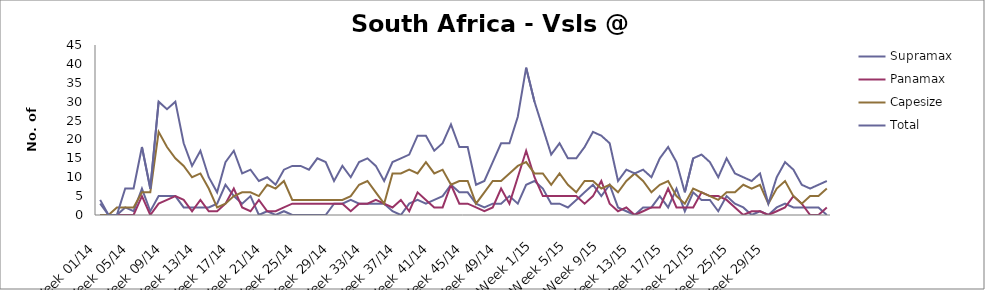
| Category | Supramax | Panamax | Capesize | Total |
|---|---|---|---|---|
| Week 01/14 | 3 | 0 | 0 | 4 |
| Week 02/14 | 0 | 0 | 0 | 0 |
| Week 03/14 | 0 | 0 | 2 | 0 |
| Week 04/14 | 2 | 0 | 2 | 7 |
| Week 05/14 | 1 | 0 | 2 | 7 |
| Week 06/14 | 7 | 5 | 6 | 18 |
| Week 07/14 | 1 | 0 | 6 | 7 |
| Week 08/14 | 5 | 3 | 22 | 30 |
| Week 09/14 | 5 | 4 | 18 | 28 |
| Week 10/14 | 5 | 5 | 15 | 30 |
| Week 11/14 | 2 | 4 | 13 | 19 |
| Week 12/14 | 2 | 1 | 10 | 13 |
| Week 13/14 | 2 | 4 | 11 | 17 |
| Week 14/14 | 2 | 1 | 7 | 10 |
| Week 15/14 | 3 | 1 | 2 | 6 |
| Week 16/14 | 8 | 3 | 3 | 14 |
| Week 17/14 | 5 | 7 | 5 | 17 |
| Week 18/14 | 3 | 2 | 6 | 11 |
| Week 19/14 | 5 | 1 | 6 | 12 |
| Week 20/14 | 0 | 4 | 5 | 9 |
| Week 21/14 | 1 | 1 | 8 | 10 |
| Week 22/14 | 0 | 1 | 7 | 8 |
| Week 23/14 | 1 | 2 | 9 | 12 |
| Week 24/14 | 0 | 3 | 4 | 13 |
| Week 25/14 | 0 | 3 | 4 | 13 |
| Week 26/14 | 0 | 3 | 4 | 12 |
| Week 27/14 | 0 | 3 | 4 | 15 |
| Week 28/14 | 0 | 3 | 4 | 14 |
| Week 29/14 | 3 | 3 | 4 | 9 |
| Week 30/14 | 3 | 3 | 4 | 13 |
| Week 31/14 | 4 | 1 | 5 | 10 |
| Week 32/14 | 3 | 3 | 8 | 14 |
| Week 33/14 | 3 | 3 | 9 | 15 |
| Week 34/14 | 3 | 4 | 6 | 13 |
| Week 35/14 | 3 | 3 | 3 | 9 |
| Week 36/14 | 1 | 2 | 11 | 14 |
| Week 37/14 | 0 | 4 | 11 | 15 |
| Week 38/14 | 3 | 1 | 12 | 16 |
| Week 39/14 | 4 | 6 | 11 | 21 |
| Week 40/14 | 3 | 4 | 14 | 21 |
| Week 41/14 | 4 | 2 | 11 | 17 |
| Week 42/14 | 5 | 2 | 12 | 19 |
| Week 43/14 | 8 | 8 | 8 | 24 |
| Week 44/14 | 6 | 3 | 9 | 18 |
| Week 45/14 | 6 | 3 | 9 | 18 |
| Week 46/14 | 3 | 2 | 3 | 8 |
| Week 47/14 | 2 | 1 | 6 | 9 |
| Week 48/14 | 3 | 2 | 9 | 14 |
| Week 49/14 | 3 | 7 | 9 | 19 |
| Week 50/14 | 5 | 3 | 11 | 19 |
| Week 51/14 | 3 | 10 | 13 | 26 |
| Week 52/14 | 8 | 17 | 14 | 39 |
| Week 1/15 | 9 | 10 | 11 | 30 |
| Week 2/15 | 7 | 5 | 11 | 23 |
| Week 3/15 | 3 | 5 | 8 | 16 |
| Week 4/15 | 3 | 5 | 11 | 19 |
| Week 5/15 | 2 | 5 | 8 | 15 |
| Week 6/15 | 4 | 5 | 6 | 15 |
| Week 7/15 | 6 | 3 | 9 | 18 |
| Week 8/15 | 8 | 5 | 9 | 22 |
| Week 9/15 | 5 | 9 | 7 | 21 |
| Week 10/15 | 8 | 3 | 8 | 19 |
| Week 11/15 | 2 | 1 | 6 | 9 |
| Week 12/15 | 1 | 2 | 9 | 12 |
| Week 13/15 | 0 | 0 | 11 | 11 |
| Week 14/15 | 2 | 1 | 9 | 12 |
| Week 15/15 | 2 | 2 | 6 | 10 |
| Week 16/15 | 5 | 2 | 8 | 15 |
| Week 17/15 | 2 | 7 | 9 | 18 |
| Week 18/15 | 7 | 2 | 5 | 14 |
| Week 19/15 | 1 | 2 | 3 | 6 |
| Week 20/15 | 6 | 2 | 7 | 15 |
| Week 21/15 | 4 | 6 | 6 | 16 |
| Week 22/15 | 4 | 5 | 5 | 14 |
| Week 23/15 | 1 | 5 | 4 | 10 |
| Week 24/15 | 5 | 4 | 6 | 15 |
| Week 25/15 | 3 | 2 | 6 | 11 |
| Week 26/15 | 2 | 0 | 8 | 10 |
| Week 27/15 | 0 | 1 | 7 | 9 |
| Week 28/15 | 1 | 1 | 8 | 11 |
| Week 29/15 | 0 | 0 | 3 | 3 |
| Week 30/15 | 2 | 1 | 7 | 10 |
| Week 31/15 | 3 | 2 | 9 | 14 |